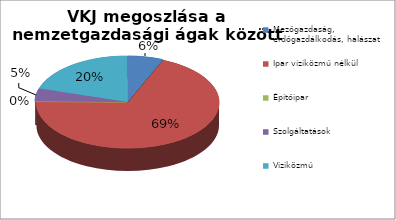
| Category | Series 0 |
|---|---|
| Mezőgazdaság, erdőgazdálkodás, halászat | 862394339 |
| Ipar víziközmű nélkül | 9378232024 |
| Építőipar | 19481911 |
| Szolgáltatások | 615928004 |
| Víziközmű | 2771711699 |